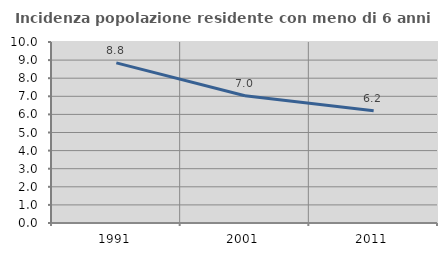
| Category | Incidenza popolazione residente con meno di 6 anni |
|---|---|
| 1991.0 | 8.849 |
| 2001.0 | 7.027 |
| 2011.0 | 6.208 |